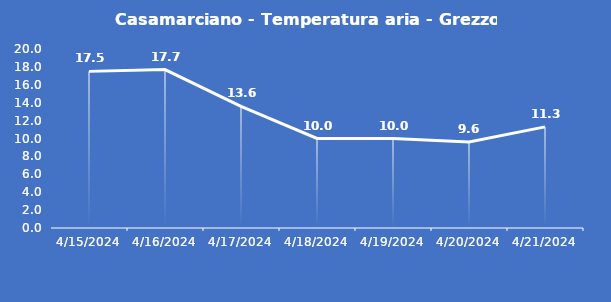
| Category | Casamarciano - Temperatura aria - Grezzo (°C) |
|---|---|
| 4/15/24 | 17.5 |
| 4/16/24 | 17.7 |
| 4/17/24 | 13.6 |
| 4/18/24 | 10 |
| 4/19/24 | 10 |
| 4/20/24 | 9.6 |
| 4/21/24 | 11.3 |